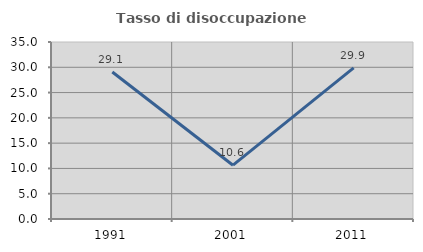
| Category | Tasso di disoccupazione giovanile  |
|---|---|
| 1991.0 | 29.07 |
| 2001.0 | 10.638 |
| 2011.0 | 29.885 |